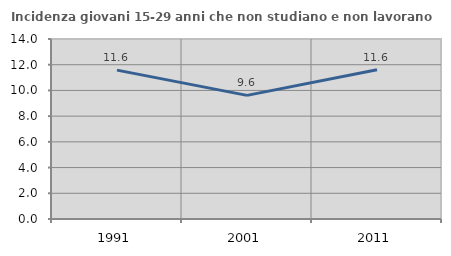
| Category | Incidenza giovani 15-29 anni che non studiano e non lavorano  |
|---|---|
| 1991.0 | 11.577 |
| 2001.0 | 9.617 |
| 2011.0 | 11.611 |